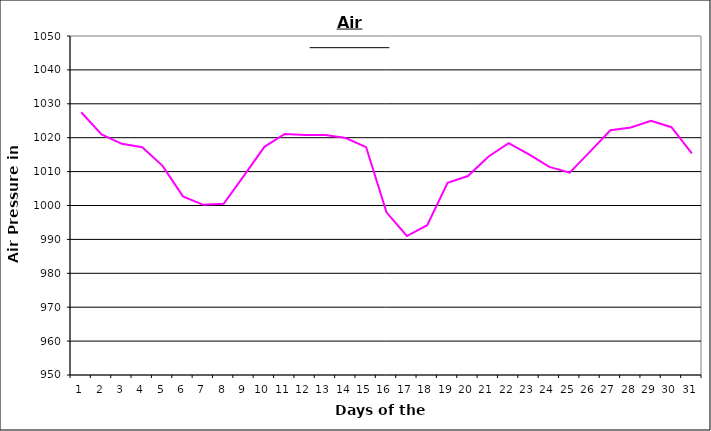
| Category | Series 0 |
|---|---|
| 0 | 1027.5 |
| 1 | 1021 |
| 2 | 1018.2 |
| 3 | 1017.2 |
| 4 | 1011.7 |
| 5 | 1002.7 |
| 6 | 1000.2 |
| 7 | 1000.5 |
| 8 | 1008.8 |
| 9 | 1017.3 |
| 10 | 1021.1 |
| 11 | 1020.8 |
| 12 | 1020.8 |
| 13 | 1019.9 |
| 14 | 1017.2 |
| 15 | 998 |
| 16 | 991 |
| 17 | 994.2 |
| 18 | 1006.7 |
| 19 | 1008.7 |
| 20 | 1014.4 |
| 21 | 1018.4 |
| 22 | 1015.1 |
| 23 | 1011.4 |
| 24 | 1009.7 |
| 25 | 1015.9 |
| 26 | 1022.2 |
| 27 | 1023 |
| 28 | 1025 |
| 29 | 1023.1 |
| 30 | 1015.4 |